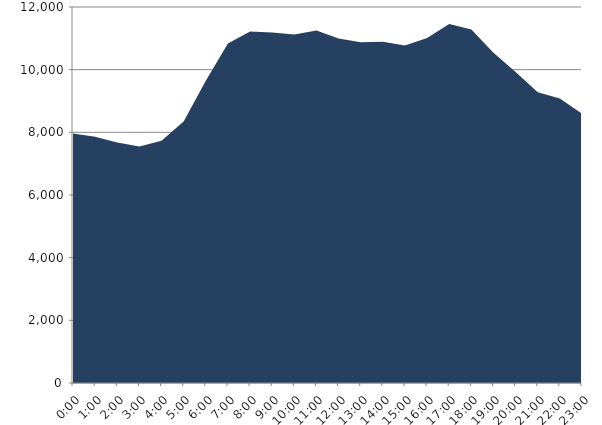
| Category | Series 0 | Series 1 |
|---|---|---|
| 2018-01-17 |  | 7961.49 |
| 2018-01-17 01:00:00 |  | 7862.39 |
| 2018-01-17 02:00:00 |  | 7672.01 |
| 2018-01-17 03:00:00 |  | 7550.36 |
| 2018-01-17 04:00:00 |  | 7730.28 |
| 2018-01-17 05:00:00 |  | 8346.37 |
| 2018-01-17 06:00:00 |  | 9648.56 |
| 2018-01-17 07:00:00 |  | 10837.95 |
| 2018-01-17 08:00:00 |  | 11216.21 |
| 2018-01-17 09:00:00 |  | 11189.15 |
| 2018-01-17 10:00:00 |  | 11122.04 |
| 2018-01-17 11:00:00 |  | 11253.7 |
| 2018-01-17 12:00:00 |  | 10996.9 |
| 2018-01-17 13:00:00 |  | 10873.46 |
| 2018-01-17 14:00:00 |  | 10894.54 |
| 2018-01-17 15:00:00 |  | 10774.85 |
| 2018-01-17 16:00:00 |  | 11010.83 |
| 2018-01-17 17:00:00 |  | 11455.12 |
| 2018-01-17 18:00:00 |  | 11284.61 |
| 2018-01-17 19:00:00 |  | 10540.18 |
| 2018-01-17 20:00:00 |  | 9925.02 |
| 2018-01-17 21:00:00 |  | 9282.52 |
| 2018-01-17 22:00:00 |  | 9076.81 |
| 2018-01-17 23:00:00 |  | 8594.25 |